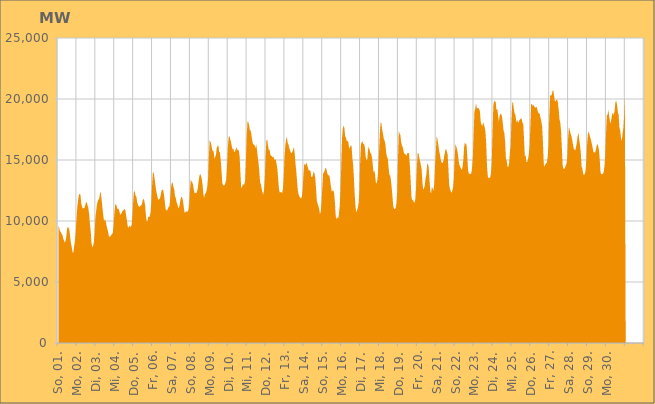
| Category | Series 0 |
|---|---|
|  So, 01.  | 9656.58 |
|  So, 01.  | 9457.386 |
|  So, 01.  | 9163.763 |
|  So, 01.  | 9114.068 |
|  So, 01.  | 8940.015 |
|  So, 01.  | 8890.558 |
|  So, 01.  | 8589.552 |
|  So, 01.  | 8412.481 |
|  So, 01.  | 8222.787 |
|  So, 01.  | 8361.094 |
|  So, 01.  | 8703.732 |
|  So, 01.  | 9348.156 |
|  So, 01.  | 9528.698 |
|  So, 01.  | 9431.563 |
|  So, 01.  | 9204.336 |
|  So, 01.  | 8665.278 |
|  So, 01.  | 8132.541 |
|  Mo, 02.  | 7865.191 |
|  Mo, 02.  | 7417.705 |
|  Mo, 02.  | 7426.422 |
|  Mo, 02.  | 7932.041 |
|  Mo, 02.  | 8357.806 |
|  Mo, 02.  | 9103.575 |
|  Mo, 02.  | 10214.927 |
|  Mo, 02.  | 11154.093 |
|  Mo, 02.  | 11674.924 |
|  Mo, 02.  | 12137.61 |
|  Mo, 02.  | 12223.718 |
|  Mo, 02.  | 12135.795 |
|  Mo, 02.  | 11447.326 |
|  Mo, 02.  | 11166.235 |
|  Mo, 02.  | 11030.13 |
|  Mo, 02.  | 11048.735 |
|  Mo, 02.  | 11066.336 |
|  Mo, 02.  | 11281.912 |
|  Mo, 02.  | 11518.83 |
|  Mo, 02.  | 11552.407 |
|  Mo, 02.  | 11287.025 |
|  Mo, 02.  | 11066.432 |
|  Mo, 02.  | 10570.366 |
|  Mo, 02.  | 9779.376 |
|  Di, 03.  | 9152.831 |
|  Di, 03.  | 8197.001 |
|  Di, 03.  | 7851.417 |
|  Di, 03.  | 7935.711 |
|  Di, 03.  | 8249.591 |
|  Di, 03.  | 9003.533 |
|  Di, 03.  | 10310.884 |
|  Di, 03.  | 10844.831 |
|  Di, 03.  | 11363.324 |
|  Di, 03.  | 11653.876 |
|  Di, 03.  | 11753.672 |
|  Di, 03.  | 11891.286 |
|  Di, 03.  | 12385.918 |
|  Di, 03.  | 12231.508 |
|  Di, 03.  | 11660.715 |
|  Di, 03.  | 10992.819 |
|  Di, 03.  | 10444.371 |
|  Di, 03.  | 9952.352 |
|  Di, 03.  | 10137.813 |
|  Di, 03.  | 10017.04 |
|  Di, 03.  | 9661.485 |
|  Di, 03.  | 9380.224 |
|  Di, 03.  | 9106.691 |
|  Di, 03.  | 8801.284 |
|  Mi, 04.  | 8693.318 |
|  Mi, 04.  | 8755.179 |
|  Mi, 04.  | 8828.646 |
|  Mi, 04.  | 8941.701 |
|  Mi, 04.  | 8993.844 |
|  Mi, 04.  | 9597.501 |
|  Mi, 04.  | 10572.757 |
|  Mi, 04.  | 11273.786 |
|  Mi, 04.  | 11400.483 |
|  Mi, 04.  | 11198.059 |
|  Mi, 04.  | 10980.952 |
|  Mi, 04.  | 11035.034 |
|  Mi, 04.  | 10864.357 |
|  Mi, 04.  | 10644.024 |
|  Mi, 04.  | 10496.236 |
|  Mi, 04.  | 10604.823 |
|  Mi, 04.  | 10795.377 |
|  Mi, 04.  | 10854.645 |
|  Mi, 04.  | 10914.009 |
|  Mi, 04.  | 11017.028 |
|  Mi, 04.  | 10847.4 |
|  Mi, 04.  | 10423.392 |
|  Mi, 04.  | 10023.198 |
|  Mi, 04.  | 9556.379 |
|  Do, 05.  | 9441.593 |
|  Do, 05.  | 9588.465 |
|  Do, 05.  | 9579.219 |
|  Do, 05.  | 9498.052 |
|  Do, 05.  | 9719.253 |
|  Do, 05.  | 10532.951 |
|  Do, 05.  | 11691.145 |
|  Do, 05.  | 12495.205 |
|  Do, 05.  | 12369.179 |
|  Do, 05.  | 12084.896 |
|  Do, 05.  | 11988.702 |
|  Do, 05.  | 11520.697 |
|  Do, 05.  | 11328.482 |
|  Do, 05.  | 11184.274 |
|  Do, 05.  | 11159.461 |
|  Do, 05.  | 11251.038 |
|  Do, 05.  | 11270.215 |
|  Do, 05.  | 11399.654 |
|  Do, 05.  | 11682.664 |
|  Do, 05.  | 11846.536 |
|  Do, 05.  | 11655.736 |
|  Do, 05.  | 11322.336 |
|  Do, 05.  | 10535.747 |
|  Do, 05.  | 9998.214 |
|  Fr, 06.  | 9962.644 |
|  Fr, 06.  | 10377.187 |
|  Fr, 06.  | 10286.321 |
|  Fr, 06.  | 10389.146 |
|  Fr, 06.  | 10725.941 |
|  Fr, 06.  | 11610.509 |
|  Fr, 06.  | 13034.356 |
|  Fr, 06.  | 14020.965 |
|  Fr, 06.  | 13938.085 |
|  Fr, 06.  | 13502.601 |
|  Fr, 06.  | 13000.388 |
|  Fr, 06.  | 12543.109 |
|  Fr, 06.  | 12205.907 |
|  Fr, 06.  | 11908.14 |
|  Fr, 06.  | 11742.921 |
|  Fr, 06.  | 11775.204 |
|  Fr, 06.  | 11885.135 |
|  Fr, 06.  | 12147.748 |
|  Fr, 06.  | 12504.087 |
|  Fr, 06.  | 12587.791 |
|  Fr, 06.  | 12525.429 |
|  Fr, 06.  | 12138.903 |
|  Fr, 06.  | 11609.516 |
|  Fr, 06.  | 10984.939 |
|  Sa, 07.  | 10871.028 |
|  Sa, 07.  | 10877.696 |
|  Sa, 07.  | 11014.707 |
|  Sa, 07.  | 11164.386 |
|  Sa, 07.  | 11214.549 |
|  Sa, 07.  | 11879.866 |
|  Sa, 07.  | 12765.345 |
|  Sa, 07.  | 13136.559 |
|  Sa, 07.  | 13148.639 |
|  Sa, 07.  | 12797.726 |
|  Sa, 07.  | 12607.13 |
|  Sa, 07.  | 12024.803 |
|  Sa, 07.  | 11881.885 |
|  Sa, 07.  | 11536.35 |
|  Sa, 07.  | 11382.292 |
|  Sa, 07.  | 11106.459 |
|  Sa, 07.  | 11086.116 |
|  Sa, 07.  | 11342.732 |
|  Sa, 07.  | 11780.67 |
|  Sa, 07.  | 11998.914 |
|  Sa, 07.  | 11930.967 |
|  Sa, 07.  | 11694.982 |
|  Sa, 07.  | 11232.351 |
|  Sa, 07.  | 10703.144 |
|  So, 08.  | 10684.129 |
|  So, 08.  | 10826.27 |
|  So, 08.  | 10730.702 |
|  So, 08.  | 10776.666 |
|  So, 08.  | 10886.913 |
|  So, 08.  | 11457.513 |
|  So, 08.  | 12531.217 |
|  So, 08.  | 13402.227 |
|  So, 08.  | 13233.173 |
|  So, 08.  | 13158.249 |
|  So, 08.  | 12949.772 |
|  So, 08.  | 12517.922 |
|  So, 08.  | 12248.865 |
|  So, 08.  | 12320.08 |
|  So, 08.  | 12257.621 |
|  So, 08.  | 12427.235 |
|  So, 08.  | 12712.435 |
|  So, 08.  | 13278.468 |
|  So, 08.  | 13711.632 |
|  So, 08.  | 13864.445 |
|  So, 08.  | 13703.004 |
|  So, 08.  | 13434.397 |
|  So, 08.  | 12977.998 |
|  So, 08.  | 12151.182 |
|  Mo, 09.  | 11918.994 |
|  Mo, 09.  | 12207.829 |
|  Mo, 09.  | 12283.888 |
|  Mo, 09.  | 12478.745 |
|  Mo, 09.  | 12828.474 |
|  Mo, 09.  | 13534.401 |
|  Mo, 09.  | 15290.432 |
|  Mo, 09.  | 16624.843 |
|  Mo, 09.  | 16492.741 |
|  Mo, 09.  | 16285.941 |
|  Mo, 09.  | 15887.132 |
|  Mo, 09.  | 15707.27 |
|  Mo, 09.  | 15713.814 |
|  Mo, 09.  | 15089.422 |
|  Mo, 09.  | 15254.935 |
|  Mo, 09.  | 15408.031 |
|  Mo, 09.  | 16020.842 |
|  Mo, 09.  | 16130.726 |
|  Mo, 09.  | 16200.378 |
|  Mo, 09.  | 15705.337 |
|  Mo, 09.  | 15580.238 |
|  Mo, 09.  | 15031.715 |
|  Mo, 09.  | 14101.265 |
|  Mo, 09.  | 13119.246 |
|  Di, 10.  | 12928.521 |
|  Di, 10.  | 12909.537 |
|  Di, 10.  | 12934.778 |
|  Di, 10.  | 13125.349 |
|  Di, 10.  | 13402.144 |
|  Di, 10.  | 14467.863 |
|  Di, 10.  | 15918.794 |
|  Di, 10.  | 16816.995 |
|  Di, 10.  | 16975.897 |
|  Di, 10.  | 16727.336 |
|  Di, 10.  | 16487.887 |
|  Di, 10.  | 16163.929 |
|  Di, 10.  | 15854.119 |
|  Di, 10.  | 15946.291 |
|  Di, 10.  | 15664.502 |
|  Di, 10.  | 15678 |
|  Di, 10.  | 15857.041 |
|  Di, 10.  | 16048.869 |
|  Di, 10.  | 15848.251 |
|  Di, 10.  | 15822.701 |
|  Di, 10.  | 15770.011 |
|  Di, 10.  | 15291.41 |
|  Di, 10.  | 13926.545 |
|  Di, 10.  | 12760.665 |
|  Mi, 11.  | 12717.916 |
|  Mi, 11.  | 13009.669 |
|  Mi, 11.  | 12983.967 |
|  Mi, 11.  | 13008.551 |
|  Mi, 11.  | 13338.481 |
|  Mi, 11.  | 14972.997 |
|  Mi, 11.  | 16982.943 |
|  Mi, 11.  | 18179.186 |
|  Mi, 11.  | 18116.459 |
|  Mi, 11.  | 17877.637 |
|  Mi, 11.  | 17432.938 |
|  Mi, 11.  | 17426.959 |
|  Mi, 11.  | 17052.734 |
|  Mi, 11.  | 16573.396 |
|  Mi, 11.  | 16297.625 |
|  Mi, 11.  | 16277.236 |
|  Mi, 11.  | 16220.598 |
|  Mi, 11.  | 15960.175 |
|  Mi, 11.  | 16303.797 |
|  Mi, 11.  | 15848.368 |
|  Mi, 11.  | 15264.142 |
|  Mi, 11.  | 14760.951 |
|  Mi, 11.  | 14044.704 |
|  Mi, 11.  | 13182.761 |
|  Do, 12.  | 12993.949 |
|  Do, 12.  | 12651.376 |
|  Do, 12.  | 12353.613 |
|  Do, 12.  | 12146.792 |
|  Do, 12.  | 12545.43 |
|  Do, 12.  | 13578.382 |
|  Do, 12.  | 15370.073 |
|  Do, 12.  | 16591.23 |
|  Do, 12.  | 16682.97 |
|  Do, 12.  | 16231.039 |
|  Do, 12.  | 15824.957 |
|  Do, 12.  | 15838.052 |
|  Do, 12.  | 15437.944 |
|  Do, 12.  | 15333.02 |
|  Do, 12.  | 15309.58 |
|  Do, 12.  | 15199.745 |
|  Do, 12.  | 15293.791 |
|  Do, 12.  | 15011.569 |
|  Do, 12.  | 15069.972 |
|  Do, 12.  | 15005.12 |
|  Do, 12.  | 14648.243 |
|  Do, 12.  | 14222.336 |
|  Do, 12.  | 13395.732 |
|  Do, 12.  | 12584.385 |
|  Fr, 13.  | 12329.138 |
|  Fr, 13.  | 12376.776 |
|  Fr, 13.  | 12348.413 |
|  Fr, 13.  | 12302.169 |
|  Fr, 13.  | 12631.84 |
|  Fr, 13.  | 13655.464 |
|  Fr, 13.  | 15256.633 |
|  Fr, 13.  | 16216.2 |
|  Fr, 13.  | 16655.736 |
|  Fr, 13.  | 16914.505 |
|  Fr, 13.  | 16402.898 |
|  Fr, 13.  | 16287.661 |
|  Fr, 13.  | 15990.162 |
|  Fr, 13.  | 15799.397 |
|  Fr, 13.  | 15597.211 |
|  Fr, 13.  | 15558.803 |
|  Fr, 13.  | 15677.278 |
|  Fr, 13.  | 15842.76 |
|  Fr, 13.  | 16084.932 |
|  Fr, 13.  | 15435.841 |
|  Fr, 13.  | 14650.666 |
|  Fr, 13.  | 14014.61 |
|  Fr, 13.  | 13181.181 |
|  Fr, 13.  | 12429.486 |
|  Sa, 14.  | 12173.076 |
|  Sa, 14.  | 11982.63 |
|  Sa, 14.  | 11899.771 |
|  Sa, 14.  | 11861.211 |
|  Sa, 14.  | 11997.261 |
|  Sa, 14.  | 12579.376 |
|  Sa, 14.  | 13741.999 |
|  Sa, 14.  | 14696.356 |
|  Sa, 14.  | 14625.87 |
|  Sa, 14.  | 14603.333 |
|  Sa, 14.  | 14820.571 |
|  Sa, 14.  | 14512.453 |
|  Sa, 14.  | 14320.009 |
|  Sa, 14.  | 14085.944 |
|  Sa, 14.  | 14192.591 |
|  Sa, 14.  | 14079.254 |
|  Sa, 14.  | 13599.232 |
|  Sa, 14.  | 13596.015 |
|  Sa, 14.  | 13789.323 |
|  Sa, 14.  | 14062.398 |
|  Sa, 14.  | 13921.244 |
|  Sa, 14.  | 13520.235 |
|  Sa, 14.  | 12670.788 |
|  Sa, 14.  | 11666.098 |
|  So, 15.  | 11406.22 |
|  So, 15.  | 11222.688 |
|  So, 15.  | 10956.754 |
|  So, 15.  | 10541.794 |
|  So, 15.  | 10768.529 |
|  So, 15.  | 11577.519 |
|  So, 15.  | 12733.97 |
|  So, 15.  | 13879.399 |
|  So, 15.  | 13992.484 |
|  So, 15.  | 14152.403 |
|  So, 15.  | 14353.822 |
|  So, 15.  | 14288.931 |
|  So, 15.  | 13948.655 |
|  So, 15.  | 13791.887 |
|  So, 15.  | 13719.52 |
|  So, 15.  | 13741.56 |
|  So, 15.  | 13281.264 |
|  So, 15.  | 12754.816 |
|  So, 15.  | 12404.031 |
|  So, 15.  | 12468.359 |
|  So, 15.  | 12527.28 |
|  So, 15.  | 12244.953 |
|  So, 15.  | 11459.383 |
|  So, 15.  | 10385.258 |
|  Mo, 16.  | 10145.142 |
|  Mo, 16.  | 10321.073 |
|  Mo, 16.  | 10192.351 |
|  Mo, 16.  | 10546.603 |
|  Mo, 16.  | 11207.746 |
|  Mo, 16.  | 12524.628 |
|  Mo, 16.  | 14483.185 |
|  Mo, 16.  | 16789.232 |
|  Mo, 16.  | 17604.157 |
|  Mo, 16.  | 17824.61 |
|  Mo, 16.  | 17602.656 |
|  Mo, 16.  | 16936.168 |
|  Mo, 16.  | 16835.032 |
|  Mo, 16.  | 16536.849 |
|  Mo, 16.  | 16565.096 |
|  Mo, 16.  | 16442.388 |
|  Mo, 16.  | 15938.672 |
|  Mo, 16.  | 16035.581 |
|  Mo, 16.  | 16188.981 |
|  Mo, 16.  | 16195.459 |
|  Mo, 16.  | 15249.474 |
|  Mo, 16.  | 14678.311 |
|  Mo, 16.  | 13619.276 |
|  Mo, 16.  | 12260.291 |
|  Di, 17.  | 11224.368 |
|  Di, 17.  | 10695.883 |
|  Di, 17.  | 10905.596 |
|  Di, 17.  | 11062.887 |
|  Di, 17.  | 11455.856 |
|  Di, 17.  | 12480.029 |
|  Di, 17.  | 14854.138 |
|  Di, 17.  | 16316.421 |
|  Di, 17.  | 16429.818 |
|  Di, 17.  | 16550.452 |
|  Di, 17.  | 16303.821 |
|  Di, 17.  | 16298.788 |
|  Di, 17.  | 16017.844 |
|  Di, 17.  | 15278.442 |
|  Di, 17.  | 14997.136 |
|  Di, 17.  | 15045.33 |
|  Di, 17.  | 15831.383 |
|  Di, 17.  | 16112.509 |
|  Di, 17.  | 15811.17 |
|  Di, 17.  | 15556.161 |
|  Di, 17.  | 15527.776 |
|  Di, 17.  | 15202.755 |
|  Di, 17.  | 14632.881 |
|  Di, 17.  | 13953.775 |
|  Mi, 18.  | 14155.189 |
|  Mi, 18.  | 13751.663 |
|  Mi, 18.  | 13103.67 |
|  Mi, 18.  | 13097.032 |
|  Mi, 18.  | 13444.704 |
|  Mi, 18.  | 14270.096 |
|  Mi, 18.  | 15691.001 |
|  Mi, 18.  | 17218.618 |
|  Mi, 18.  | 18094.612 |
|  Mi, 18.  | 18008.908 |
|  Mi, 18.  | 17458.461 |
|  Mi, 18.  | 17130.145 |
|  Mi, 18.  | 16742.599 |
|  Mi, 18.  | 16584.15 |
|  Mi, 18.  | 16307.493 |
|  Mi, 18.  | 15624.986 |
|  Mi, 18.  | 15270.574 |
|  Mi, 18.  | 15156.42 |
|  Mi, 18.  | 14439.123 |
|  Mi, 18.  | 13810.964 |
|  Mi, 18.  | 13714.091 |
|  Mi, 18.  | 13398.042 |
|  Mi, 18.  | 12730.22 |
|  Mi, 18.  | 12006.334 |
|  Do, 19.  | 11232.351 |
|  Do, 19.  | 10990.46 |
|  Do, 19.  | 10994.224 |
|  Do, 19.  | 11050.394 |
|  Do, 19.  | 11445.966 |
|  Do, 19.  | 12354.561 |
|  Do, 19.  | 15054.222 |
|  Do, 19.  | 17419.614 |
|  Do, 19.  | 17163.062 |
|  Do, 19.  | 17066.982 |
|  Do, 19.  | 16473.472 |
|  Do, 19.  | 16183.177 |
|  Do, 19.  | 16064.073 |
|  Do, 19.  | 15734.765 |
|  Do, 19.  | 15523.213 |
|  Do, 19.  | 15486.834 |
|  Do, 19.  | 15408.055 |
|  Do, 19.  | 15356.631 |
|  Do, 19.  | 15595.421 |
|  Do, 19.  | 15580.871 |
|  Do, 19.  | 15555.087 |
|  Do, 19.  | 14612.746 |
|  Do, 19.  | 13435.191 |
|  Do, 19.  | 12024.434 |
|  Fr, 20.  | 11689.772 |
|  Fr, 20.  | 11768.323 |
|  Fr, 20.  | 11533.106 |
|  Fr, 20.  | 11509.055 |
|  Fr, 20.  | 11751.513 |
|  Fr, 20.  | 12791.274 |
|  Fr, 20.  | 14416.524 |
|  Fr, 20.  | 15595.983 |
|  Fr, 20.  | 15563.716 |
|  Fr, 20.  | 15174.467 |
|  Fr, 20.  | 14936.634 |
|  Fr, 20.  | 14595.458 |
|  Fr, 20.  | 14227.362 |
|  Fr, 20.  | 13181.619 |
|  Fr, 20.  | 12556.837 |
|  Fr, 20.  | 12679.564 |
|  Fr, 20.  | 12893.076 |
|  Fr, 20.  | 13491.512 |
|  Fr, 20.  | 13805.151 |
|  Fr, 20.  | 14610.925 |
|  Fr, 20.  | 14722.151 |
|  Fr, 20.  | 14379.343 |
|  Fr, 20.  | 13339.262 |
|  Fr, 20.  | 12437.64 |
|  Sa, 21.  | 12259.792 |
|  Sa, 21.  | 12789.729 |
|  Sa, 21.  | 12652.643 |
|  Sa, 21.  | 12447.013 |
|  Sa, 21.  | 13057.038 |
|  Sa, 21.  | 14466.251 |
|  Sa, 21.  | 15628.219 |
|  Sa, 21.  | 16919.9 |
|  Sa, 21.  | 16742.216 |
|  Sa, 21.  | 16331.52 |
|  Sa, 21.  | 15831.774 |
|  Sa, 21.  | 15505.315 |
|  Sa, 21.  | 15119.64 |
|  Sa, 21.  | 14831.02 |
|  Sa, 21.  | 14748.554 |
|  Sa, 21.  | 14779.68 |
|  Sa, 21.  | 15018.244 |
|  Sa, 21.  | 15451.225 |
|  Sa, 21.  | 15770.254 |
|  Sa, 21.  | 15947.592 |
|  Sa, 21.  | 15672.775 |
|  Sa, 21.  | 15448.286 |
|  Sa, 21.  | 14283.364 |
|  Sa, 21.  | 12953.115 |
|  So, 22.  | 12633.743 |
|  So, 22.  | 12430.758 |
|  So, 22.  | 12309.57 |
|  So, 22.  | 12492.201 |
|  So, 22.  | 12813.108 |
|  So, 22.  | 13608.55 |
|  So, 22.  | 15311.858 |
|  So, 22.  | 16335.971 |
|  So, 22.  | 16105.993 |
|  So, 22.  | 15872.255 |
|  So, 22.  | 15516.79 |
|  So, 22.  | 14933.837 |
|  So, 22.  | 14578.97 |
|  So, 22.  | 14442.708 |
|  So, 22.  | 14270.823 |
|  So, 22.  | 14186.23 |
|  So, 22.  | 14487.246 |
|  So, 22.  | 15066.213 |
|  So, 22.  | 16096.331 |
|  So, 22.  | 16442.988 |
|  So, 22.  | 16293.587 |
|  So, 22.  | 16260.237 |
|  So, 22.  | 15224.714 |
|  So, 22.  | 14157.585 |
|  Mo, 23.  | 13864.904 |
|  Mo, 23.  | 13862.564 |
|  Mo, 23.  | 13839.489 |
|  Mo, 23.  | 13905.179 |
|  Mo, 23.  | 14343.784 |
|  Mo, 23.  | 15202.809 |
|  Mo, 23.  | 17142.013 |
|  Mo, 23.  | 18976.392 |
|  Mo, 23.  | 19185.45 |
|  Mo, 23.  | 19689.736 |
|  Mo, 23.  | 19246.935 |
|  Mo, 23.  | 19241.291 |
|  Mo, 23.  | 19277.011 |
|  Mo, 23.  | 19160.038 |
|  Mo, 23.  | 18991.948 |
|  Mo, 23.  | 18103.751 |
|  Mo, 23.  | 17899.955 |
|  Mo, 23.  | 17764.491 |
|  Mo, 23.  | 18092.69 |
|  Mo, 23.  | 17930.189 |
|  Mo, 23.  | 17675.233 |
|  Mo, 23.  | 17323.173 |
|  Mo, 23.  | 16270.141 |
|  Mo, 23.  | 14465.691 |
|  Di, 24.  | 13658.175 |
|  Di, 24.  | 13503.124 |
|  Di, 24.  | 13549.532 |
|  Di, 24.  | 13574.253 |
|  Di, 24.  | 13877.161 |
|  Di, 24.  | 14861.714 |
|  Di, 24.  | 17294.046 |
|  Di, 24.  | 19442.922 |
|  Di, 24.  | 19868.785 |
|  Di, 24.  | 19767.718 |
|  Di, 24.  | 19764.041 |
|  Di, 24.  | 19087.963 |
|  Di, 24.  | 19203.624 |
|  Di, 24.  | 18670.674 |
|  Di, 24.  | 18122.706 |
|  Di, 24.  | 18624.015 |
|  Di, 24.  | 18776.454 |
|  Di, 24.  | 18782.324 |
|  Di, 24.  | 18559.471 |
|  Di, 24.  | 18002.127 |
|  Di, 24.  | 17417.643 |
|  Di, 24.  | 17205.025 |
|  Di, 24.  | 16483.727 |
|  Di, 24.  | 15144.954 |
|  Mi, 25.  | 14908.012 |
|  Mi, 25.  | 14452.459 |
|  Mi, 25.  | 14422.904 |
|  Mi, 25.  | 14708.144 |
|  Mi, 25.  | 15609.728 |
|  Mi, 25.  | 16207.182 |
|  Mi, 25.  | 18176.269 |
|  Mi, 25.  | 19701.343 |
|  Mi, 25.  | 19743.59 |
|  Mi, 25.  | 19210.487 |
|  Mi, 25.  | 18822.614 |
|  Mi, 25.  | 18702.611 |
|  Mi, 25.  | 18227.2 |
|  Mi, 25.  | 18079.965 |
|  Mi, 25.  | 18265.063 |
|  Mi, 25.  | 18020.804 |
|  Mi, 25.  | 18246.528 |
|  Mi, 25.  | 18342.9 |
|  Mi, 25.  | 18404.02 |
|  Mi, 25.  | 18371.09 |
|  Mi, 25.  | 18043.374 |
|  Mi, 25.  | 17944.022 |
|  Mi, 25.  | 16695.329 |
|  Mi, 25.  | 15306.423 |
|  Do, 26.  | 15412.776 |
|  Do, 26.  | 14799.357 |
|  Do, 26.  | 14862.57 |
|  Do, 26.  | 15055.179 |
|  Do, 26.  | 15467.32 |
|  Do, 26.  | 16063.104 |
|  Do, 26.  | 17704.699 |
|  Do, 26.  | 19591.901 |
|  Do, 26.  | 19579.236 |
|  Do, 26.  | 19429.121 |
|  Do, 26.  | 19530.196 |
|  Do, 26.  | 19365.203 |
|  Do, 26.  | 19302.437 |
|  Do, 26.  | 19296.971 |
|  Do, 26.  | 19367.375 |
|  Do, 26.  | 19093.417 |
|  Do, 26.  | 18844.163 |
|  Do, 26.  | 18887.518 |
|  Do, 26.  | 18728.227 |
|  Do, 26.  | 18437.957 |
|  Do, 26.  | 18137.823 |
|  Do, 26.  | 17707.008 |
|  Do, 26.  | 16440.488 |
|  Do, 26.  | 14666.923 |
|  Fr, 27.  | 14453.418 |
|  Fr, 27.  | 14647.945 |
|  Fr, 27.  | 14724.206 |
|  Fr, 27.  | 14806.191 |
|  Fr, 27.  | 15271.523 |
|  Fr, 27.  | 16229.722 |
|  Fr, 27.  | 18526.922 |
|  Fr, 27.  | 20225.982 |
|  Fr, 27.  | 20365.269 |
|  Fr, 27.  | 20280.858 |
|  Fr, 27.  | 20628.099 |
|  Fr, 27.  | 20743.054 |
|  Fr, 27.  | 20337.194 |
|  Fr, 27.  | 19844.066 |
|  Fr, 27.  | 19815.367 |
|  Fr, 27.  | 19940.53 |
|  Fr, 27.  | 19953 |
|  Fr, 27.  | 19683.737 |
|  Fr, 27.  | 19077.006 |
|  Fr, 27.  | 18309.696 |
|  Fr, 27.  | 18056.057 |
|  Fr, 27.  | 17327.294 |
|  Fr, 27.  | 15979.011 |
|  Fr, 27.  | 14556.626 |
|  Sa, 28.  | 14294.177 |
|  Sa, 28.  | 14246.106 |
|  Sa, 28.  | 14384.631 |
|  Sa, 28.  | 14570.922 |
|  Sa, 28.  | 14727.053 |
|  Sa, 28.  | 15414.484 |
|  Sa, 28.  | 16867.402 |
|  Sa, 28.  | 17712.523 |
|  Sa, 28.  | 17436.162 |
|  Sa, 28.  | 17169.871 |
|  Sa, 28.  | 16980.255 |
|  Sa, 28.  | 16675.093 |
|  Sa, 28.  | 16289.209 |
|  Sa, 28.  | 15937.815 |
|  Sa, 28.  | 15859.434 |
|  Sa, 28.  | 15771.674 |
|  Sa, 28.  | 16107.761 |
|  Sa, 28.  | 16416.54 |
|  Sa, 28.  | 16944.792 |
|  Sa, 28.  | 17228.141 |
|  Sa, 28.  | 16679.929 |
|  Sa, 28.  | 16212.013 |
|  Sa, 28.  | 15634.525 |
|  Sa, 28.  | 14465.039 |
|  So, 29.  | 14303.104 |
|  So, 29.  | 13867.178 |
|  So, 29.  | 13774.974 |
|  So, 29.  | 13833.826 |
|  So, 29.  | 14088.912 |
|  So, 29.  | 14850.029 |
|  So, 29.  | 16215.93 |
|  So, 29.  | 17114.143 |
|  So, 29.  | 17342.81 |
|  So, 29.  | 17077.822 |
|  So, 29.  | 16829.382 |
|  So, 29.  | 16635.648 |
|  So, 29.  | 16327.796 |
|  So, 29.  | 16012.992 |
|  So, 29.  | 15662.842 |
|  So, 29.  | 15615.951 |
|  So, 29.  | 15603.576 |
|  So, 29.  | 15774.847 |
|  So, 29.  | 16140.655 |
|  So, 29.  | 16319.036 |
|  So, 29.  | 16151.882 |
|  So, 29.  | 15818.336 |
|  So, 29.  | 15092.453 |
|  So, 29.  | 13985.966 |
|  Mo, 30.  | 13827.811 |
|  Mo, 30.  | 13871.625 |
|  Mo, 30.  | 13817.875 |
|  Mo, 30.  | 14016.156 |
|  Mo, 30.  | 14427.489 |
|  Mo, 30.  | 15367.658 |
|  Mo, 30.  | 17087.569 |
|  Mo, 30.  | 18660.043 |
|  Mo, 30.  | 18706.312 |
|  Mo, 30.  | 19129.75 |
|  Mo, 30.  | 18571.759 |
|  Mo, 30.  | 18172.484 |
|  Mo, 30.  | 17978.415 |
|  Mo, 30.  | 18432.32 |
|  Mo, 30.  | 18827.613 |
|  Mo, 30.  | 18833.953 |
|  Mo, 30.  | 18691.458 |
|  Mo, 30.  | 19062.913 |
|  Mo, 30.  | 19758.264 |
|  Mo, 30.  | 19851.468 |
|  Mo, 30.  | 19520.887 |
|  Mo, 30.  | 18966.751 |
|  Mo, 30.  | 18727.457 |
|  Mo, 30.  | 17693.206 |
|  Di, 01.  | 17421.454 |
|  Di, 01.  | 16853.159 |
|  Di, 01.  | 16529.548 |
|  Di, 01.  | 17165.432 |
|  Di, 01.  | 17576.813 |
|  Di, 01.  | 18548.292 |
|    | 20072.276 |
|    | 0 |
|    | 0 |
|    | 0 |
|    | 0 |
|    | 0 |
|    | 0 |
|    | 0 |
|    | 0 |
|    | 0 |
|    | 0 |
|    | 0 |
|    | 0 |
|    | 0 |
|    | 0 |
|    | 0 |
|    | 0 |
|    | 0 |
|    | 0 |
|    | 0 |
|    | 0 |
|    | 0 |
|    | 0 |
|    | 0 |